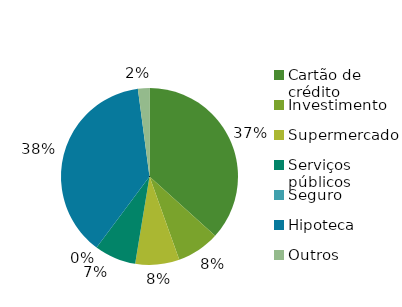
| Category | Total |
|---|---|
| Cartão de crédito | 936.48 |
| Investimento | 200 |
| Supermercado | 205.61 |
| Serviços públicos | 194.2 |
| Seguro | 0 |
| Hipoteca | 961.77 |
| Outros | 53.65 |